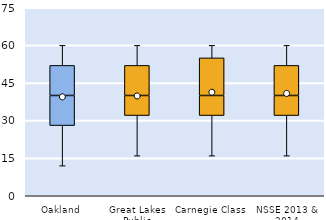
| Category | 25th | 50th | 75th |
|---|---|---|---|
| Oakland | 28 | 12 | 12 |
| Great Lakes Public | 32 | 8 | 12 |
| Carnegie Class | 32 | 8 | 15 |
| NSSE 2013 & 2014 | 32 | 8 | 12 |